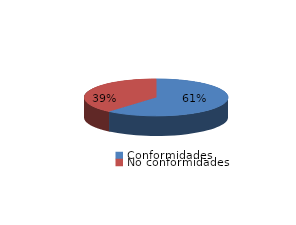
| Category | Series 0 |
|---|---|
| Conformidades | 169 |
| No conformidades | 107 |